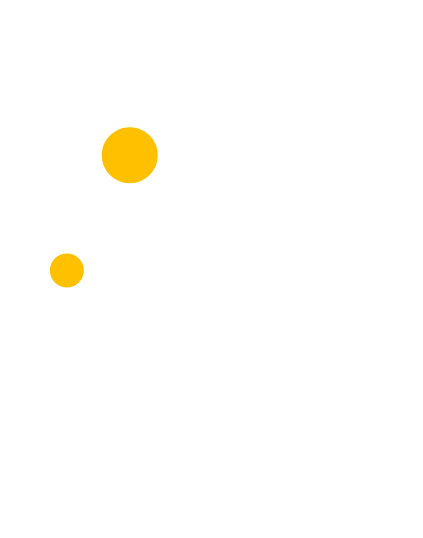
| Category | Series 0 |
|---|---|
| 77.12 | 28.38 |
| 73.16 | 22 |
| 0.0 | 0 |